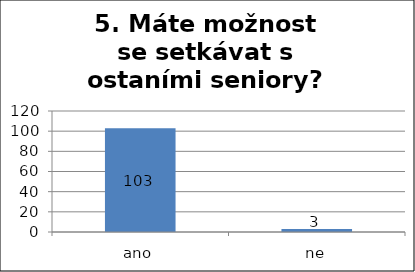
| Category | Series 0 |
|---|---|
| ano | 103 |
| ne | 3 |